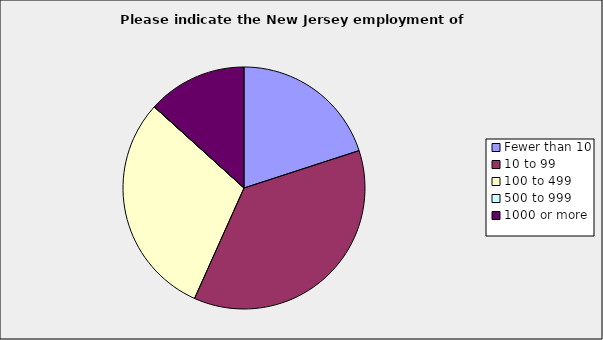
| Category | Series 0 |
|---|---|
| Fewer than 10 | 0.2 |
| 10 to 99 | 0.367 |
| 100 to 499 | 0.3 |
| 500 to 999 | 0 |
| 1000 or more | 0.133 |